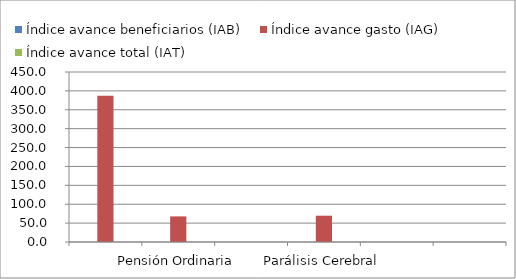
| Category | Índice avance beneficiarios (IAB)  | Índice avance gasto (IAG) | Índice avance total (IAT)  |
|---|---|---|---|
|  | 0 | 387.345 | 0 |
| Pensión Ordinaria | 0 | 67.77 | 0 |
|  | 0 | 0 | 0 |
| Parálisis Cerebral | 0 | 69.552 | 0 |